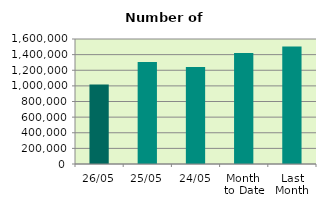
| Category | Series 0 |
|---|---|
| 26/05 | 1017656 |
| 25/05 | 1304424 |
| 24/05 | 1240720 |
| Month 
to Date | 1420630 |
| Last
Month | 1505043.474 |